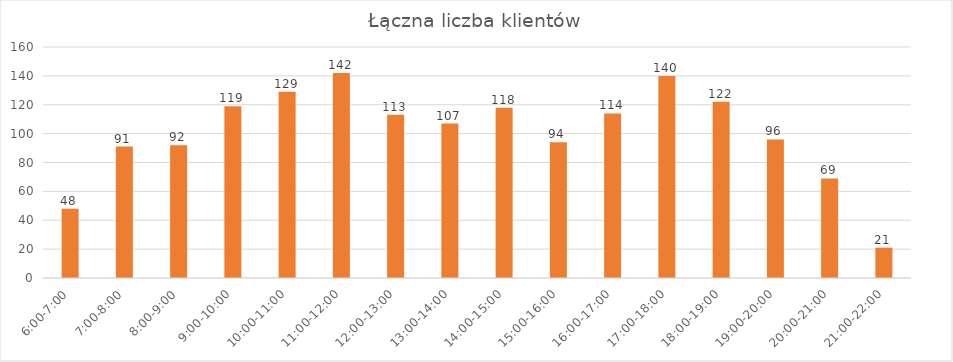
| Category | Wchodzący |
|---|---|
| 6:00-7:00 | 48 |
| 7:00-8:00 | 91 |
| 8:00-9:00 | 92 |
| 9:00-10:00 | 119 |
| 10:00-11:00 | 129 |
| 11:00-12:00 | 142 |
| 12:00-13:00 | 113 |
| 13:00-14:00 | 107 |
| 14:00-15:00 | 118 |
| 15:00-16:00 | 94 |
| 16:00-17:00 | 114 |
| 17:00-18:00 | 140 |
| 18:00-19:00 | 122 |
| 19:00-20:00 | 96 |
| 20:00-21:00 | 69 |
| 21:00-22:00 | 21 |